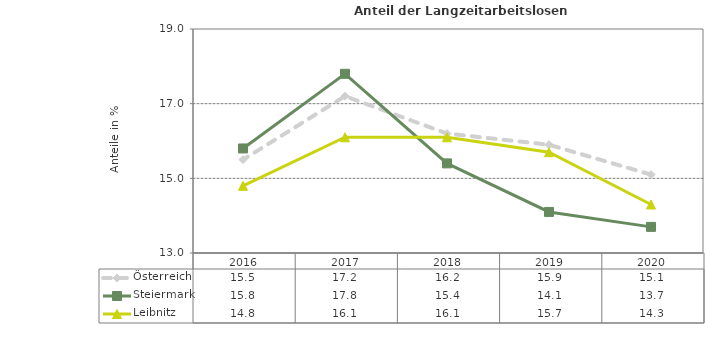
| Category | Österreich | Steiermark | Leibnitz |
|---|---|---|---|
| 2020.0 | 15.1 | 13.7 | 14.3 |
| 2019.0 | 15.9 | 14.1 | 15.7 |
| 2018.0 | 16.2 | 15.4 | 16.1 |
| 2017.0 | 17.2 | 17.8 | 16.1 |
| 2016.0 | 15.5 | 15.8 | 14.8 |